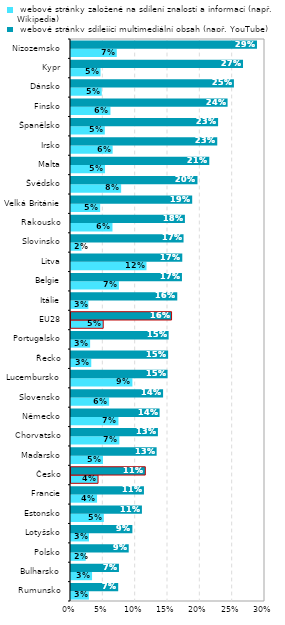
| Category |  webové stránky založené na sdílení znalostí a informací (např. Wikipedia) |  webové stránky sdílející multimediální obsah (např. YouTube) |
|---|---|---|
| Rumunsko | 0.028 | 0.073 |
| Bulharsko | 0.033 | 0.074 |
| Polsko | 0.023 | 0.089 |
| Lotyšsko | 0.028 | 0.095 |
| Estonsko | 0.051 | 0.11 |
| Francie | 0.04 | 0.113 |
| Česko | 0.042 | 0.115 |
| Maďarsko | 0.049 | 0.132 |
| Chorvatsko | 0.075 | 0.134 |
| Německo | 0.073 | 0.137 |
| Slovensko | 0.059 | 0.142 |
| Lucembursko | 0.095 | 0.149 |
| Řecko | 0.031 | 0.15 |
| Portugalsko | 0.03 | 0.151 |
| EU28 | 0.05 | 0.155 |
| Itálie | 0.027 | 0.164 |
| Belgie | 0.074 | 0.172 |
| Litva | 0.117 | 0.172 |
| Slovinsko | 0.016 | 0.174 |
| Rakousko | 0.064 | 0.176 |
| Velká Británie | 0.045 | 0.187 |
| Švédsko | 0.078 | 0.196 |
| Malta | 0.053 | 0.214 |
| Irsko | 0.064 | 0.226 |
| Španělsko | 0.052 | 0.227 |
| Finsko | 0.061 | 0.242 |
| Dánsko | 0.048 | 0.252 |
| Kypr | 0.046 | 0.266 |
| Nizozemsko | 0.071 | 0.288 |